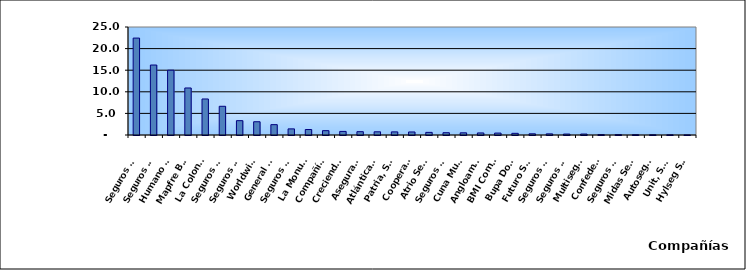
| Category | Series 0 |
|---|---|
| Seguros Universal, S. A. | 22.432 |
| Seguros Reservas, S. A. | 16.198 |
| Humano Seguros, S. A. | 15.001 |
| Mapfre BHD Compañía de Seguros | 10.885 |
| La Colonial, S. A., Compañia De Seguros | 8.339 |
| Seguros Sura, S.A. | 6.645 |
| Seguros Crecer, S. A. | 3.32 |
| Worldwide Seguros, S. A. | 3.068 |
| General de Seguros, S. A. | 2.398 |
| Seguros Pepín, S. A. | 1.416 |
| La Monumental de Seguros, S. A. | 1.269 |
| Compañía Dominicana de Seguros, C. por A. | 1.008 |
| Creciendo Seguros | 0.83 |
| Aseguradora Agropecuaria Dominicana, S. A. | 0.77 |
| Atlántica Seguros, S. A. | 0.738 |
| Patria, S. A., Compañía de Seguros | 0.723 |
| Cooperativa Nacional De Seguros, Inc  | 0.702 |
| Atrio Seguros S. A. | 0.605 |
| Seguros La Internacional, S. A. | 0.531 |
| Cuna Mutual Insurance Society Dominicana | 0.504 |
| Angloamericana de Seguros, S. A. | 0.475 |
| BMI Compañía de Seguros, S. A. | 0.441 |
| Bupa Dominicana, S. A. | 0.386 |
| Futuro Seguros | 0.277 |
| Seguros Ademi, S.A. | 0.26 |
| Seguros APS, S.R.L. | 0.218 |
| Multiseguros Su, S.A. | 0.217 |
| Confederación del Canadá Dominicana, S. A. | 0.093 |
| Seguros Yunen, S.A. | 0.08 |
| Midas Seguros, S.A. | 0.063 |
| Autoseguro, S. A. | 0.049 |
| Unit, S.A. | 0.044 |
| Hylseg Seguros S.A | 0.016 |